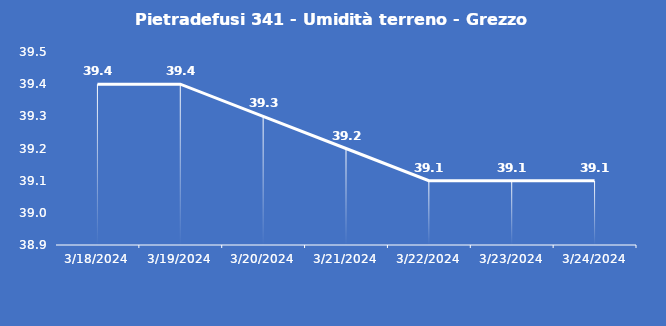
| Category | Pietradefusi 341 - Umidità terreno - Grezzo (%VWC) |
|---|---|
| 3/18/24 | 39.4 |
| 3/19/24 | 39.4 |
| 3/20/24 | 39.3 |
| 3/21/24 | 39.2 |
| 3/22/24 | 39.1 |
| 3/23/24 | 39.1 |
| 3/24/24 | 39.1 |